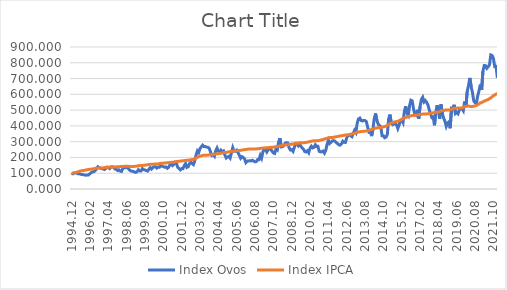
| Category | Index Ovos | Index IPCA |
|---|---|---|
| 1994.12 | 100 | 100 |
| 1995.01 | 96.22 | 101.7 |
| 1995.02 | 101.181 | 102.737 |
| 1995.03 | 102.304 | 104.33 |
| 1995.04 | 99.291 | 106.865 |
| 1995.05 | 96.338 | 109.718 |
| 1995.06 | 95.983 | 112.198 |
| 1995.07 | 92.735 | 114.846 |
| 1995.08 | 92.321 | 115.983 |
| 1995.09 | 90.018 | 117.131 |
| 1995.10 | 88.836 | 118.782 |
| 1995.11 | 87.183 | 120.529 |
| 1995.12 | 89.014 | 122.409 |
| 1996.01 | 89.25 | 124.049 |
| 1996.02 | 97.342 | 125.327 |
| 1996.03 | 104.135 | 125.765 |
| 1996.04 | 108.151 | 127.35 |
| 1996.05 | 110.159 | 128.904 |
| 1996.06 | 117.307 | 130.438 |
| 1996.07 | 127.407 | 131.886 |
| 1996.08 | 140.815 | 132.466 |
| 1996.09 | 136.503 | 132.665 |
| 1996.10 | 132.014 | 133.063 |
| 1996.11 | 128.825 | 133.488 |
| 1996.12 | 127.525 | 134.116 |
| 1997.01 | 123.39 | 135.698 |
| 1997.02 | 129.12 | 136.377 |
| 1997.03 | 138.689 | 137.072 |
| 1997.04 | 136.031 | 138.279 |
| 1997.05 | 129.356 | 138.846 |
| 1997.06 | 139.752 | 139.595 |
| 1997.07 | 140.52 | 139.902 |
| 1997.08 | 137.685 | 139.874 |
| 1997.09 | 127.053 | 139.958 |
| 1997.10 | 125.103 | 140.28 |
| 1997.11 | 116.893 | 140.519 |
| 1997.12 | 121.323 | 141.123 |
| 1998.01 | 113.29 | 142.125 |
| 1998.02 | 111.105 | 142.608 |
| 1998.03 | 128.884 | 143.093 |
| 1998.04 | 137.33 | 143.436 |
| 1998.05 | 134.436 | 144.154 |
| 1998.06 | 137.389 | 144.182 |
| 1998.07 | 132.723 | 144.009 |
| 1998.08 | 122.091 | 143.275 |
| 1998.09 | 115.298 | 142.96 |
| 1998.10 | 112.699 | 142.988 |
| 1998.11 | 111.341 | 142.817 |
| 1998.12 | 107.62 | 143.288 |
| 1999.01 | 104.903 | 144.291 |
| 1999.02 | 109.982 | 145.806 |
| 1999.03 | 122.504 | 147.41 |
| 1999.04 | 114.767 | 148.236 |
| 1999.05 | 114.471 | 148.68 |
| 1999.06 | 129.12 | 148.963 |
| 1999.07 | 122.682 | 150.586 |
| 1999.08 | 120.201 | 151.43 |
| 1999.09 | 116.834 | 151.899 |
| 1999.10 | 113.763 | 153.707 |
| 1999.11 | 125.222 | 155.167 |
| 1999.12 | 135.086 | 156.098 |
| 2000.01 | 126.816 | 157.066 |
| 2000.02 | 136.562 | 157.27 |
| 2000.03 | 140.461 | 157.616 |
| 2000.04 | 141.406 | 158.278 |
| 2000.05 | 132.664 | 158.294 |
| 2000.06 | 138.63 | 158.658 |
| 2000.07 | 137.685 | 161.212 |
| 2000.08 | 148.021 | 163.324 |
| 2000.09 | 144.536 | 163.7 |
| 2000.10 | 142.351 | 163.929 |
| 2000.11 | 137.685 | 164.454 |
| 2000.12 | 140.165 | 165.424 |
| 2001.01 | 131.246 | 166.367 |
| 2001.02 | 137.33 | 167.132 |
| 2001.03 | 152.569 | 167.767 |
| 2001.04 | 161.725 | 168.74 |
| 2001.05 | 148.789 | 169.432 |
| 2001.06 | 155.523 | 170.313 |
| 2001.07 | 168.813 | 172.578 |
| 2001.08 | 163.32 | 173.786 |
| 2001.09 | 136.976 | 174.273 |
| 2001.10 | 130.006 | 175.719 |
| 2001.11 | 121.323 | 176.967 |
| 2001.12 | 129.77 | 178.117 |
| 2002.01 | 129.002 | 179.043 |
| 2002.02 | 149.144 | 179.688 |
| 2002.03 | 161.311 | 180.766 |
| 2002.04 | 136.858 | 182.212 |
| 2002.05 | 141.465 | 182.595 |
| 2002.06 | 160.957 | 183.362 |
| 2002.07 | 170.112 | 185.544 |
| 2002.08 | 160.839 | 186.75 |
| 2002.09 | 154.696 | 188.094 |
| 2002.10 | 179.209 | 190.558 |
| 2002.11 | 215.239 | 196.313 |
| 2002.12 | 241.524 | 200.436 |
| 2003.01 | 231.305 | 204.946 |
| 2003.02 | 256.527 | 208.163 |
| 2003.03 | 267.513 | 210.724 |
| 2003.04 | 277.909 | 212.768 |
| 2003.05 | 269.285 | 214.066 |
| 2003.06 | 268.872 | 213.745 |
| 2003.07 | 265.564 | 214.172 |
| 2003.08 | 264.501 | 214.9 |
| 2003.09 | 258.653 | 216.576 |
| 2003.10 | 235.263 | 217.205 |
| 2003.11 | 213.269 | 217.943 |
| 2003.12 | 217.716 | 219.076 |
| 2004.01 | 207.842 | 220.741 |
| 2004.02 | 242.995 | 222.088 |
| 2004.03 | 260.204 | 223.132 |
| 2004.04 | 239.666 | 223.957 |
| 2004.05 | 230.929 | 225.099 |
| 2004.06 | 245.703 | 226.698 |
| 2004.07 | 236.114 | 228.761 |
| 2004.08 | 241.088 | 230.339 |
| 2004.09 | 214.846 | 231.099 |
| 2004.10 | 196.235 | 232.116 |
| 2004.11 | 202.325 | 233.718 |
| 2004.12 | 206.882 | 235.728 |
| 2005.01 | 195.944 | 237.095 |
| 2005.02 | 229.746 | 238.494 |
| 2005.03 | 262.245 | 239.948 |
| 2005.04 | 239.389 | 242.036 |
| 2005.05 | 239.226 | 243.222 |
| 2005.06 | 246.315 | 243.173 |
| 2005.07 | 230.654 | 243.781 |
| 2005.08 | 214.109 | 244.196 |
| 2005.09 | 194.757 | 245.05 |
| 2005.10 | 205.047 | 246.888 |
| 2005.11 | 200.202 | 248.246 |
| 2005.12 | 191.512 | 249.14 |
| 2006.01 | 167.369 | 250.61 |
| 2006.02 | 176.421 | 251.637 |
| 2006.03 | 177.537 | 252.719 |
| 2006.04 | 179.696 | 253.25 |
| 2006.05 | 177.802 | 253.503 |
| 2006.06 | 182.233 | 252.971 |
| 2006.07 | 176.351 | 253.451 |
| 2006.08 | 172.122 | 253.578 |
| 2006.09 | 174.041 | 254.111 |
| 2006.10 | 186.909 | 254.949 |
| 2006.11 | 185.876 | 255.74 |
| 2006.12 | 212.995 | 256.967 |
| 2007.01 | 195.512 | 258.098 |
| 2007.02 | 234.721 | 259.233 |
| 2007.03 | 251.884 | 260.193 |
| 2007.04 | 249.925 | 260.843 |
| 2007.05 | 234.462 | 261.573 |
| 2007.06 | 248.979 | 262.306 |
| 2007.07 | 255.692 | 262.935 |
| 2007.08 | 253.715 | 264.171 |
| 2007.09 | 238.918 | 264.647 |
| 2007.10 | 228.584 | 265.441 |
| 2007.11 | 225.211 | 266.449 |
| 2007.12 | 253.786 | 268.421 |
| 2008.01 | 247.597 | 269.871 |
| 2008.02 | 298.264 | 271.193 |
| 2008.03 | 321.914 | 272.495 |
| 2008.04 | 266.927 | 273.993 |
| 2008.05 | 268.375 | 276.158 |
| 2008.06 | 274.138 | 278.201 |
| 2008.07 | 290.203 | 279.676 |
| 2008.08 | 293.372 | 280.459 |
| 2008.09 | 291.498 | 281.188 |
| 2008.10 | 261.462 | 282.454 |
| 2008.11 | 247.145 | 283.47 |
| 2008.12 | 249.273 | 284.264 |
| 2009.01 | 238.637 | 285.629 |
| 2009.02 | 263.279 | 287.2 |
| 2009.03 | 289.836 | 287.774 |
| 2009.04 | 289.193 | 289.155 |
| 2009.05 | 274.733 | 290.514 |
| 2009.06 | 286.843 | 291.56 |
| 2009.07 | 270.553 | 292.26 |
| 2009.08 | 260.196 | 292.698 |
| 2009.09 | 251.933 | 293.401 |
| 2009.10 | 237.079 | 294.222 |
| 2009.11 | 234.499 | 295.429 |
| 2009.12 | 242.677 | 296.522 |
| 2010.01 | 229.77 | 298.746 |
| 2010.02 | 258.712 | 301.076 |
| 2010.03 | 271.471 | 302.641 |
| 2010.04 | 260.484 | 304.366 |
| 2010.05 | 263.969 | 305.675 |
| 2010.06 | 280.567 | 305.675 |
| 2010.07 | 269.403 | 305.706 |
| 2010.08 | 270.526 | 305.828 |
| 2010.09 | 238.866 | 307.204 |
| 2010.10 | 235.204 | 309.508 |
| 2010.11 | 236.208 | 312.077 |
| 2010.12 | 240.638 | 314.043 |
| 2011.01 | 227.289 | 316.65 |
| 2011.02 | 244.536 | 319.183 |
| 2011.03 | 281.867 | 321.705 |
| 2011.04 | 309.333 | 324.182 |
| 2011.05 | 288.955 | 325.705 |
| 2011.06 | 296.515 | 326.194 |
| 2011.07 | 304.784 | 326.716 |
| 2011.08 | 306.852 | 327.925 |
| 2011.09 | 303.071 | 329.663 |
| 2011.10 | 294.507 | 331.08 |
| 2011.11 | 287.714 | 332.802 |
| 2011.12 | 279.917 | 334.466 |
| 2012.01 | 277.909 | 336.339 |
| 2012.02 | 285.942 | 337.852 |
| 2012.03 | 302.835 | 338.562 |
| 2012.04 | 295.747 | 340.729 |
| 2012.05 | 295.224 | 341.955 |
| 2012.06 | 324.352 | 342.229 |
| 2012.07 | 338.727 | 343.701 |
| 2012.08 | 343.25 | 345.11 |
| 2012.09 | 337.508 | 347.077 |
| 2012.10 | 331.483 | 349.125 |
| 2012.11 | 354.444 | 351.219 |
| 2012.12 | 372.078 | 353.994 |
| 2013.01 | 358.519 | 357.038 |
| 2013.02 | 417.714 | 359.181 |
| 2013.03 | 444.371 | 360.869 |
| 2013.04 | 449.457 | 362.853 |
| 2013.05 | 434.012 | 364.196 |
| 2013.06 | 431.348 | 365.143 |
| 2013.07 | 434.983 | 365.252 |
| 2013.08 | 433.387 | 366.129 |
| 2013.09 | 427.213 | 367.411 |
| 2013.10 | 390.839 | 369.505 |
| 2013.11 | 360.842 | 371.5 |
| 2013.12 | 364.618 | 374.918 |
| 2014.01 | 335.317 | 376.98 |
| 2014.02 | 376.517 | 379.581 |
| 2014.03 | 445.01 | 383.073 |
| 2014.04 | 478.763 | 385.64 |
| 2014.05 | 435.695 | 387.414 |
| 2014.06 | 411.52 | 388.963 |
| 2014.07 | 401.933 | 389.002 |
| 2014.08 | 395.367 | 389.975 |
| 2014.09 | 337.506 | 392.198 |
| 2014.10 | 337.119 | 393.845 |
| 2014.11 | 324.768 | 395.854 |
| 2014.12 | 328.872 | 398.941 |
| 2015.01 | 345.153 | 403.888 |
| 2015.02 | 443.722 | 408.815 |
| 2015.03 | 471.693 | 414.212 |
| 2015.04 | 419.242 | 417.153 |
| 2015.05 | 408.211 | 420.24 |
| 2015.06 | 416.091 | 423.56 |
| 2015.07 | 410.21 | 426.186 |
| 2015.08 | 407.082 | 427.123 |
| 2015.09 | 383.025 | 429.43 |
| 2015.10 | 405.676 | 432.951 |
| 2015.11 | 431.795 | 437.324 |
| 2015.12 | 438.992 | 441.522 |
| 2016.01 | 421.501 | 447.13 |
| 2016.02 | 491.09 | 451.154 |
| 2016.03 | 523.976 | 453.094 |
| 2016.04 | 478.862 | 455.857 |
| 2016.05 | 465.825 | 459.413 |
| 2016.06 | 528.905 | 461.021 |
| 2016.07 | 562.748 | 463.418 |
| 2016.08 | 558.901 | 465.457 |
| 2016.09 | 508.486 | 465.83 |
| 2016.10 | 472.399 | 467.041 |
| 2016.11 | 466.88 | 467.882 |
| 2016.12 | 501.911 | 469.285 |
| 2017.01 | 445.764 | 471.069 |
| 2017.02 | 523.177 | 472.623 |
| 2017.03 | 568.044 | 473.805 |
| 2017.04 | 581.635 | 474.468 |
| 2017.05 | 551.686 | 475.939 |
| 2017.06 | 560.592 | 474.844 |
| 2017.07 | 549.718 | 475.984 |
| 2017.08 | 533.258 | 476.888 |
| 2017.09 | 502.002 | 477.651 |
| 2017.10 | 477.053 | 479.657 |
| 2017.11 | 452.858 | 481 |
| 2017.12 | 457.019 | 483.117 |
| 2018.01 | 403.686 | 484.518 |
| 2018.02 | 483.525 | 486.068 |
| 2018.03 | 531.391 | 486.506 |
| 2018.04 | 492.867 | 487.576 |
| 2018.05 | 445.099 | 489.526 |
| 2018.06 | 536.148 | 495.694 |
| 2018.07 | 479.095 | 497.33 |
| 2018.08 | 449.012 | 496.883 |
| 2018.09 | 429.092 | 499.268 |
| 2018.10 | 397.417 | 501.514 |
| 2018.11 | 418.113 | 500.461 |
| 2018.12 | 425.279 | 501.212 |
| 2019.01 | 385.164 | 502.816 |
| 2019.02 | 512.314 | 504.978 |
| 2019.03 | 510.511 | 508.765 |
| 2019.04 | 533.666 | 511.665 |
| 2019.05 | 478.462 | 512.33 |
| 2019.06 | 485.529 | 512.382 |
| 2019.07 | 477.259 | 513.355 |
| 2019.08 | 501.92 | 513.92 |
| 2019.09 | 505.917 | 513.714 |
| 2019.10 | 510.086 | 514.228 |
| 2019.11 | 496.448 | 516.85 |
| 2019.12 | 554.622 | 522.794 |
| 2020.01 | 521.927 | 523.892 |
| 2020.02 | 618.312 | 525.202 |
| 2020.03 | 656.058 | 525.569 |
| 2020.04 | 703.823 | 523.94 |
| 2020.05 | 649.08 | 521.949 |
| 2020.06 | 610.856 | 523.306 |
| 2020.07 | 559.084 | 525.19 |
| 2020.08 | 546.956 | 526.451 |
| 2020.09 | 544.131 | 529.82 |
| 2020.10 | 589.634 | 534.376 |
| 2020.11 | 622.311 | 539.132 |
| 2020.12 | 661.52 | 546.411 |
| 2021.01 | 628.286 | 547.777 |
| 2021.02 | 746.773 | 552.488 |
| 2021.03 | 782.621 | 557.626 |
| 2021.04 | 781.928 | 559.354 |
| 2021.05 | 765.285 | 563.997 |
| 2021.06 | 775.066 | 566.986 |
| 2021.07 | 787.447 | 572.429 |
| 2021.08 | 849.551 | 577.409 |
| 2021.09 | 845.81 | 584.107 |
| 2021.10 | 827.797 | 591.409 |
| 2021.11 | 776.083 | 597.027 |
| 2021.12 | 777.399 | 601.385 |
| 2022.01 | 704.624 | 604.633 |